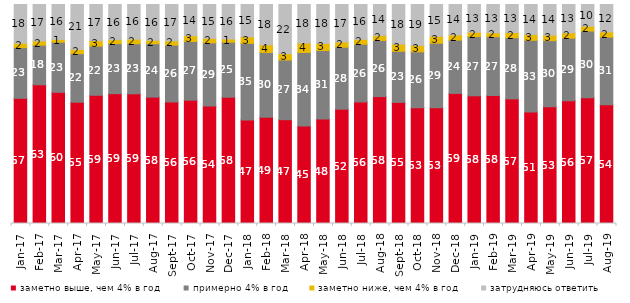
| Category | заметно выше, чем 4% в год | примерно 4% в год | заметно ниже, чем 4% в год | затрудняюсь ответить |
|---|---|---|---|---|
| 2017-01-01 | 57.15 | 23.15 | 2 | 17.7 |
| 2017-02-01 | 63.35 | 18.1 | 1.9 | 16.65 |
| 2017-03-01 | 59.9 | 22.9 | 1.25 | 15.95 |
| 2017-04-01 | 55.35 | 22.15 | 1.95 | 20.5 |
| 2017-05-01 | 58.55 | 22.45 | 2.5 | 16.5 |
| 2017-06-01 | 59.25 | 22.85 | 1.8 | 16.05 |
| 2017-07-01 | 59.2 | 22.85 | 2.1 | 15.8 |
| 2017-08-01 | 57.7 | 24.4 | 1.55 | 16.35 |
| 2017-09-01 | 55.5 | 25.95 | 1.95 | 16.6 |
| 2017-10-01 | 56.3 | 26.8 | 2.65 | 14.25 |
| 2017-11-01 | 53.6 | 28.9 | 2.05 | 15.45 |
| 2017-12-01 | 57.65 | 25.15 | 1.45 | 15.75 |
| 2018-01-01 | 47.25 | 35 | 3 | 14.75 |
| 2018-02-01 | 48.5 | 29.6 | 3.5 | 18.4 |
| 2018-03-01 | 47.4 | 27.25 | 2.9 | 22.45 |
| 2018-04-01 | 44.55 | 33.55 | 4.3 | 17.6 |
| 2018-05-01 | 47.7 | 31.3 | 3.25 | 17.75 |
| 2018-06-01 | 52.2 | 28.3 | 2.4 | 17.1 |
| 2018-07-01 | 55.5 | 26.35 | 2.25 | 15.9 |
| 2018-08-01 | 57.95 | 25.65 | 2.3 | 14.1 |
| 2018-09-01 | 55.3 | 23.35 | 3.25 | 18.1 |
| 2018-10-01 | 52.85 | 25.55 | 2.95 | 18.65 |
| 2018-11-01 | 52.844 | 29.491 | 3.144 | 14.521 |
| 2018-12-01 | 59.4 | 24.35 | 2.35 | 13.9 |
| 2019-01-01 | 58.3 | 27.05 | 2 | 12.65 |
| 2019-02-01 | 58.45 | 26.8 | 1.85 | 12.9 |
| 2019-03-01 | 56.887 | 27.946 | 2.387 | 12.78 |
| 2019-04-01 | 50.891 | 32.772 | 2.574 | 13.762 |
| 2019-05-01 | 53.343 | 30.163 | 2.526 | 13.967 |
| 2019-06-01 | 56.06 | 28.579 | 2.444 | 12.918 |
| 2019-07-01 | 57.475 | 30.396 | 2.228 | 9.901 |
| 2019-08-01 | 54.246 | 30.869 | 2.398 | 12.488 |